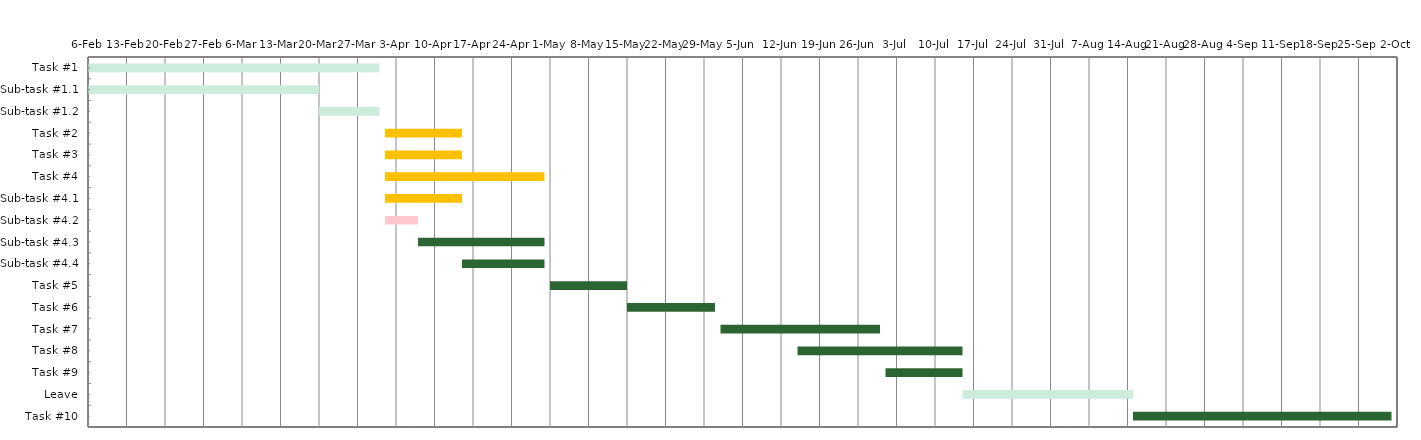
| Category | Start date | Task Duration (days) |
|---|---|---|
| Task #1 | 2023-02-06 | 53 |
| Sub-task #1.1 | 2023-02-06 | 42 |
| Sub-task #1.2 | 2023-03-20 | 11 |
| Task #2 | 2023-04-01 | 14 |
| Task #3 | 2023-04-01 | 14 |
| Task #4 | 2023-04-01 | 29 |
| Sub-task #4.1 | 2023-04-01 | 14 |
| Sub-task #4.2 | 2023-04-01 | 6 |
| Sub-task #4.3 | 2023-04-07 | 23 |
| Sub-task #4.4 | 2023-04-15 | 15 |
| Task #5 | 2023-05-01 | 14 |
| Task #6 | 2023-05-15 | 16 |
| Task #7 | 2023-06-01 | 29 |
| Task #8 | 2023-06-15 | 30 |
| Task #9 | 2023-07-01 | 14 |
| Leave | 2023-07-15 | 31 |
| Task #10 | 2023-08-15 | 47 |